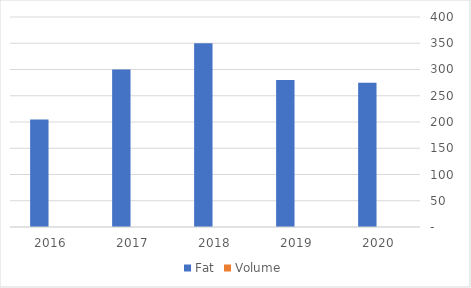
| Category | Fat | Volume |
|---|---|---|
| 2016.0 | 205 |  |
| 2017.0 | 300 |  |
| 2018.0 | 350 |  |
| 2019.0 | 280 |  |
| 2020.0 | 275 |  |